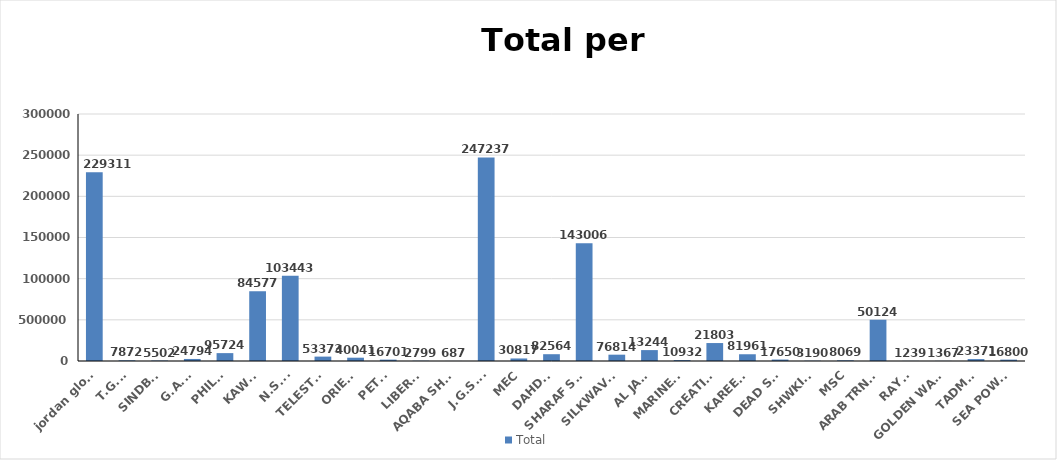
| Category | Total |
|---|---|
| jordan global | 2293117 |
| T.G.F. | 7872 |
| SINDBAD | 5502 |
| G.A.C. | 24794 |
| PHILCO | 95724 |
| KAWAR | 845778 |
| N.S.S. | 1034434 |
| TELESTAR | 53373 |
| ORIENT | 40041 |
| PETRA | 16701 |
| LIBERTY | 2799 |
| AQABA SHG. | 687 |
| J.G.S.A. | 2472376 |
| MEC | 30817 |
| DAHDAL | 82564 |
| SHARAF SHG. | 1430064 |
| SILKWAVES | 76814 |
| AL JAZI | 132441 |
| MARINERS | 10932 |
| CREATIVE | 218037 |
| KAREEM | 81961 |
| DEAD SEA | 17650 |
| SHWKINI | 3190 |
| MSC | 8069 |
| ARAB TRNSIT | 501243 |
| RAYAN | 1239 |
| GOLDEN WAYS | 1367 |
| TADMOR | 23371 |
| SEA POWER | 16800 |